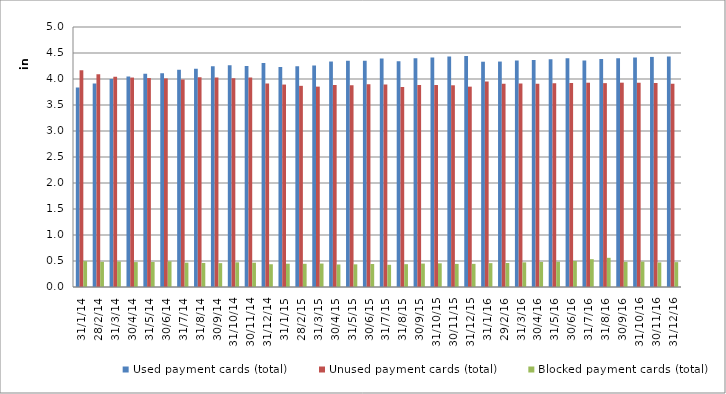
| Category | Used payment cards (total) | Unused payment cards (total) | Blocked payment cards (total) |
|---|---|---|---|
| 2014-01-31 | 3836223 | 4168119 | 496879 |
| 2014-02-28 | 3912476 | 4092450 | 483584 |
| 2014-03-31 | 3998938 | 4041785 | 489650 |
| 2014-04-30 | 4047703 | 4027792 | 479192 |
| 2014-05-31 | 4099052 | 4017826 | 481021 |
| 2014-06-30 | 4112641 | 4010796 | 493863 |
| 2014-07-31 | 4177537 | 3991566 | 467955 |
| 2014-08-31 | 4197152 | 4032029 | 462518 |
| 2014-09-30 | 4243834 | 4029659 | 458643 |
| 2014-10-31 | 4266326 | 4012706 | 474470 |
| 2014-11-30 | 4250217 | 4027993 | 467318 |
| 2014-12-31 | 4309282 | 3913019 | 437729 |
| 2015-01-31 | 4229408 | 3892960 | 448216 |
| 2015-02-28 | 4247165 | 3868610 | 446016 |
| 2015-03-31 | 4260522 | 3853338 | 450612 |
| 2015-04-30 | 4335963 | 3886894 | 433337 |
| 2015-05-31 | 4350712 | 3879402 | 436006 |
| 2015-06-30 | 4351179 | 3899077 | 442764 |
| 2015-07-31 | 4393558 | 3892978 | 427199 |
| 2015-08-31 | 4338952 | 3846770 | 439013 |
| 2015-09-30 | 4398831 | 3886560 | 450384 |
| 2015-10-31 | 4415377 | 3884162 | 455159 |
| 2015-11-30 | 4432710 | 3878924 | 444458 |
| 2015-12-31 | 4441122 | 3852949 | 444922 |
| 2016-01-31 | 4332390 | 3951033 | 458740 |
| 2016-02-29 | 4335492 | 3906412 | 461489 |
| 2016-03-31 | 4353588 | 3913926 | 473928 |
| 2016-04-30 | 4364667 | 3910281 | 481502 |
| 2016-05-31 | 4377599 | 3918512 | 484770 |
| 2016-06-30 | 4397146 | 3925078 | 499871 |
| 2016-07-31 | 4353754 | 3928567 | 534914 |
| 2016-08-31 | 4385699 | 3920372 | 561363 |
| 2016-09-30 | 4398873 | 3929420 | 482990 |
| 2016-10-31 | 4413327 | 3928433 | 487271 |
| 2016-11-30 | 4424704 | 3921612 | 472655 |
| 2016-12-31 | 4433927 | 3910471 | 478422 |